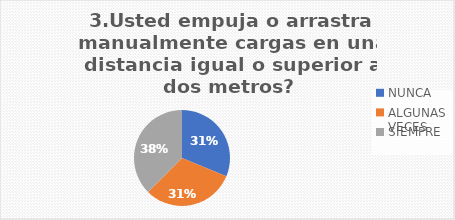
| Category | Usted empuja o arrastra manualmente cargas en una distancia igual o superior a dos metros? |
|---|---|
| NUNCA | 31.25 |
| ALGUNAS VECES  | 31.25 |
| SIEMPRE | 37.5 |